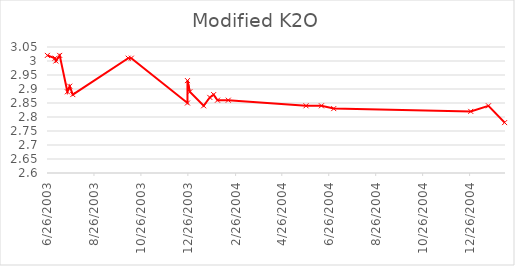
| Category | Modified K2O |
|---|---|
| 6/26/03 | 3.02 |
| 7/6/03 | 3.01 |
| 7/7/03 | 3 |
| 7/12/03 | 3.02 |
| 7/22/03 | 2.89 |
| 7/25/03 | 2.91 |
| 7/29/03 | 2.88 |
| 10/9/03 | 3.01 |
| 10/13/03 | 3.01 |
| 12/25/03 | 2.85 |
| 12/25/03 | 2.93 |
| 12/28/03 | 2.89 |
| 1/15/04 | 2.84 |
| 1/23/04 | 2.87 |
| 1/28/04 | 2.88 |
| 2/2/04 | 2.86 |
| 2/16/04 | 2.86 |
| 5/27/04 | 2.84 |
| 6/16/04 | 2.84 |
| 7/2/04 | 2.83 |
| 12/27/04 | 2.82 |
| 1/19/05 | 2.84 |
| 2/9/05 | 2.78 |